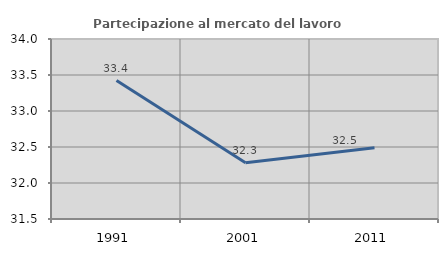
| Category | Partecipazione al mercato del lavoro  femminile |
|---|---|
| 1991.0 | 33.423 |
| 2001.0 | 32.282 |
| 2011.0 | 32.49 |